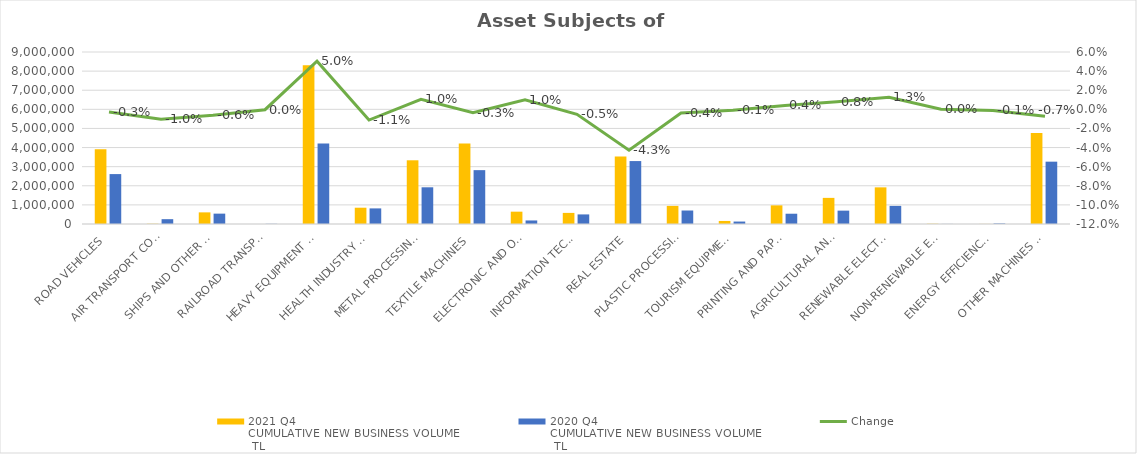
| Category | 2021 Q4 
CUMULATIVE NEW BUSINESS VOLUME
 TL | 2020 Q4 
CUMULATIVE NEW BUSINESS VOLUME
 TL |
|---|---|---|
| ROAD VEHICLES | 3916219.461 | 2612128.433 |
| AIR TRANSPORT CONVEYANCE | 12757 | 252747.655 |
| SHIPS AND OTHER SEA-GOING VESSELS | 608730.623 | 542251.666 |
| RAILROAD TRANSPORT VEHICLES | 293 | 9618.781 |
| HEAVY EQUIPMENT AND CONSTRUCTION MACHINERY | 8303718.438 | 4212846.923 |
| HEALTH INDUSTRY AND AESTHETIC INSTRUMENTS | 852333.211 | 816379.087 |
| METAL PROCESSING MACHINE | 3333559.734 | 1920726.536 |
| TEXTILE MACHINES | 4213277.268 | 2818144.288 |
| ELECTRONIC AND OPTICAL DEVICES | 645205.98 | 185398.943 |
| INFORMATION TECHNOLOGIES AND OFFICE SYSTEMS | 581077.583 | 501468.281 |
| REAL ESTATE | 3526176.695 | 3293147.226 |
| PLASTIC PROCESSING MACHINES | 947875.508 | 705956.079 |
| TOURISM EQUIPMENT | 159181.843 | 128241.207 |
| PRINTING AND PAPER PROCESSING MACHINES | 975066.7 | 537741.094 |
| AGRICULTURAL AND LIVESTOCK FARMING MACHINES | 1367215.798 | 699085.684 |
| RENEWABLE ELECTRICITY GENERATION | 1917311.087 | 948212.463 |
| NON-RENEWABLE ELECTRIC ENERGY GENERATION | 12734.067 | 4265.228 |
| ENERGY EFFICIENCY EQUIPMENT | 4127.399 | 28759.345 |
| OTHER MACHINES AND EQUIPMENT | 4757494.876 | 3261438.539 |